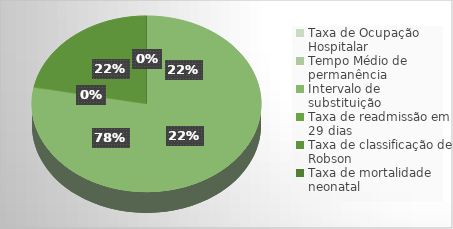
| Category | Series 0 |
|---|---|
| Taxa de Ocupação Hospitalar | 1.012 |
| Tempo Médio de permanência | 3.54 |
| Intervalo de substituição | -1 |
| Taxa de readmissão em 29 dias | 0.007 |
| Taxa de classificação de Robson | 1 |
| Taxa de mortalidade neonatal | 0 |